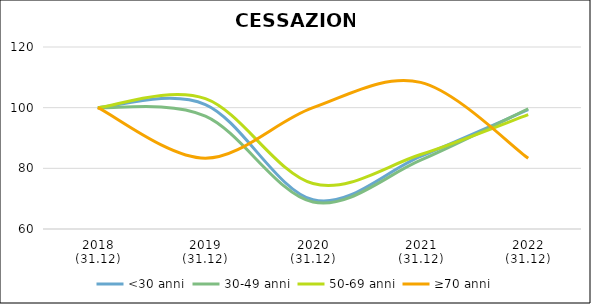
| Category | <30 anni | 30-49 anni | 50-69 anni | ≥70 anni |
|---|---|---|---|---|
| 2018
(31.12) | 100 | 100 | 100 | 100 |
| 2019
(31.12) | 101.022 | 97.2 | 102.958 | 83.333 |
| 2020
(31.12) | 69.64 | 68.882 | 74.977 | 100 |
| 2021
(31.12) | 83.946 | 82.675 | 84.554 | 108.333 |
| 2022
(31.12) | 99.332 | 99.645 | 97.7 | 83.333 |